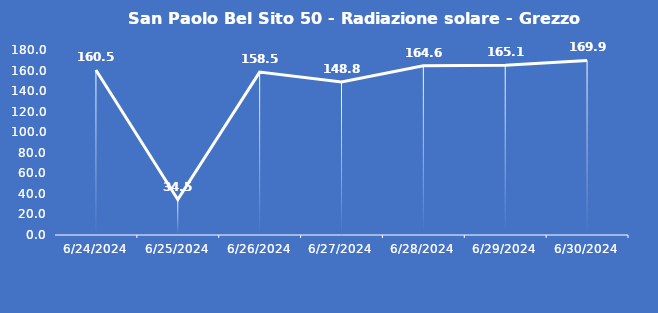
| Category | San Paolo Bel Sito 50 - Radiazione solare - Grezzo (W/m2) |
|---|---|
| 6/24/24 | 160.5 |
| 6/25/24 | 34.5 |
| 6/26/24 | 158.5 |
| 6/27/24 | 148.8 |
| 6/28/24 | 164.6 |
| 6/29/24 | 165.1 |
| 6/30/24 | 169.9 |